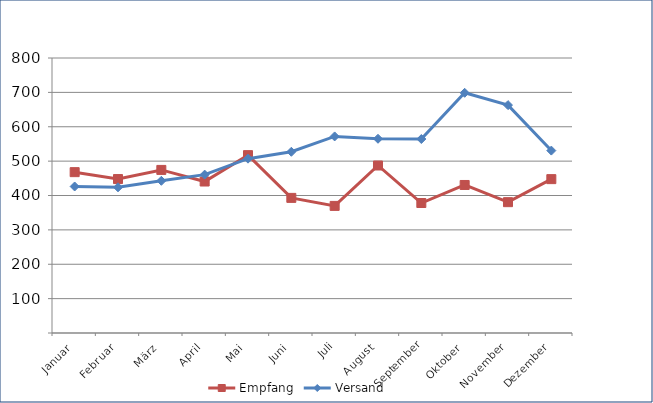
| Category | Empfang | Versand |
|---|---|---|
| Januar | 467.937 | 426.22 |
| Februar | 447.843 | 423.821 |
| März | 474.41 | 442.743 |
| April | 440.651 | 460.747 |
| Mai | 517.44 | 507.148 |
| Juni | 393.07 | 527.188 |
| Juli | 369.767 | 571.834 |
| August | 487.304 | 565.065 |
| September | 378.144 | 564.28 |
| Oktober | 430.608 | 698.767 |
| November | 380.601 | 662.96 |
| Dezember | 447.626 | 530.654 |